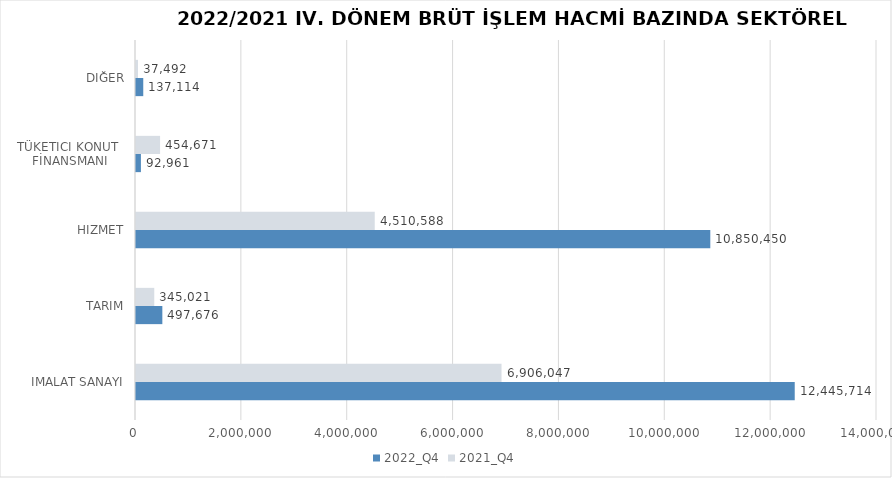
| Category | 2022_Q4 | 2021_Q4 |
|---|---|---|
| İMALAT SANAYİ | 12445714.012 | 6906047 |
| TARIM | 497676.166 | 345021 |
| HİZMET | 10850450.24 | 4510588 |
| TÜKETİCİ KONUT 
FİNANSMANI | 92961 | 454671 |
| DİĞER | 137114 | 37492 |